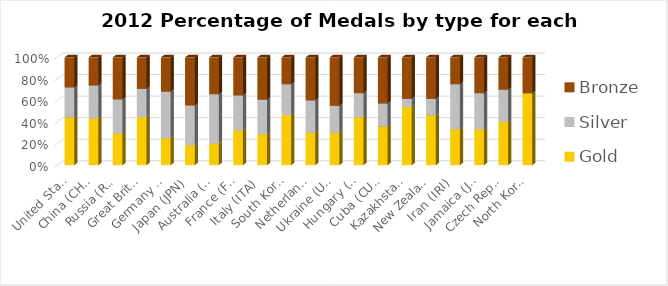
| Category | Gold | Silver | Bronze |
|---|---|---|---|
|  United States | 46 | 29 | 29 |
|  China (CHN) | 38 | 27 | 23 |
|  Russia (RUS) | 24 | 26 | 32 |
|  Great Britain (GBR) | 29 | 17 | 19 |
|  Germany (GER) | 11 | 19 | 14 |
|  Japan (JPN) | 7 | 14 | 17 |
|  Australia (AUS) | 7 | 16 | 12 |
|  France (FRA) | 11 | 11 | 12 |
|  Italy (ITA) | 8 | 9 | 11 |
|  South Korea (KOR) | 13 | 8 | 7 |
|  Netherlands (NED) | 6 | 6 | 8 |
|  Ukraine (UKR) | 6 | 5 | 9 |
|  Hungary (HUN) | 8 | 4 | 6 |
|  Cuba (CUB) | 5 | 3 | 6 |
|  Kazakhstan (KAZ) | 7 | 1 | 5 |
|  New Zealand (NZL) | 6 | 2 | 5 |
|  Iran (IRI) | 4 | 5 | 3 |
|  Jamaica (JAM) | 4 | 4 | 4 |
|  Czech Republic (CZE) | 4 | 3 | 3 |
|  North Korea (PRK) | 4 | 0 | 2 |